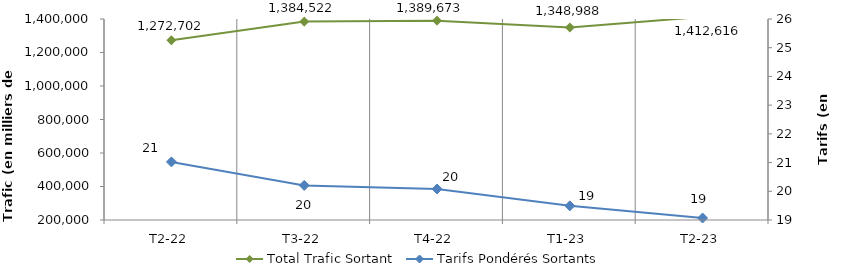
| Category | Total Trafic Sortant |
|---|---|
| T2-22 | 1272702.154 |
| T3-22 | 1384522.427 |
| T4-22 | 1389673.381 |
| T1-23 | 1348987.713 |
| T2-23 | 1412615.915 |